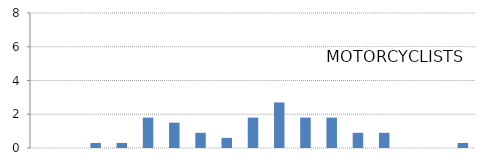
| Category | MOTORCYCLISTS |
|---|---|
| 0-4  | 0 |
| 5-9 | 0 |
| 10-14 | 0.3 |
| 15-19  | 0.3 |
| 20-24  | 1.8 |
| 25-29  | 1.5 |
| 30-34  | 0.9 |
| 35-39  | 0.6 |
| 40-44  | 1.8 |
| 45-49  | 2.7 |
| 50-54  | 1.8 |
| 55-59  | 1.8 |
| 60-64  | 0.9 |
| 65-69  | 0.9 |
| 70-74  | 0 |
| 75-79  | 0 |
| 80+ | 0.3 |